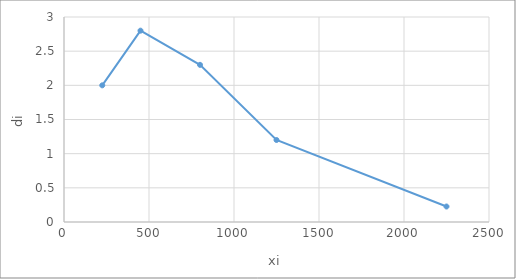
| Category | Series 0 |
|---|---|
| 225.0 | 2 |
| 450.0 | 2.8 |
| 800.0 | 2.3 |
| 1250.0 | 1.2 |
| 2250.0 | 0.227 |